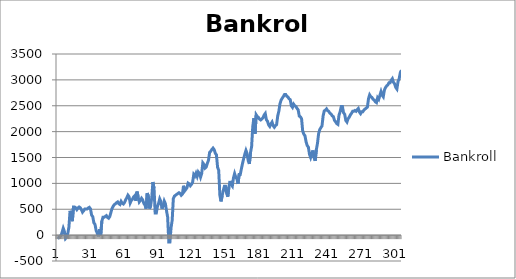
| Category | Bankroll |
|---|---|
| 0 | -35 |
| 1 | -50 |
| 2 | -22.665 |
| 3 | -7.665 |
| 4 | 55.335 |
| 5 | 133.035 |
| 6 | 73.035 |
| 7 | -66.965 |
| 8 | -42.965 |
| 9 | 29.275 |
| 10 | 155.275 |
| 11 | 468.715 |
| 12 | 408.715 |
| 13 | 268.715 |
| 14 | 542.795 |
| 15 | 542.795 |
| 16 | 527.795 |
| 17 | 492.795 |
| 18 | 524.61 |
| 19 | 544.11 |
| 20 | 529.11 |
| 21 | 494.11 |
| 22 | 444.11 |
| 23 | 471.11 |
| 24 | 504.43 |
| 25 | 504.43 |
| 26 | 504.43 |
| 27 | 525.01 |
| 28 | 537.01 |
| 29 | 507.01 |
| 30 | 387.01 |
| 31 | 357.01 |
| 32 | 237.01 |
| 33 | 207.01 |
| 34 | 87.01 |
| 35 | 37.01 |
| 36 | -22.99 |
| 37 | 114.05 |
| 38 | -5.95 |
| 39 | 268.13 |
| 40 | 343.13 |
| 41 | 343.13 |
| 42 | 361.54 |
| 43 | 376.54 |
| 44 | 341.54 |
| 45 | 326.54 |
| 46 | 359.54 |
| 47 | 438.38 |
| 48 | 515.28 |
| 49 | 558.73 |
| 50 | 587.885 |
| 51 | 605.885 |
| 52 | 626.465 |
| 53 | 641.465 |
| 54 | 606.465 |
| 55 | 591.465 |
| 56 | 651.465 |
| 57 | 616.465 |
| 58 | 601.465 |
| 59 | 630.025 |
| 60 | 682.105 |
| 61 | 722.105 |
| 62 | 772.105 |
| 63 | 742.105 |
| 64 | 622.105 |
| 65 | 670.105 |
| 66 | 694.105 |
| 67 | 737.505 |
| 68 | 761.505 |
| 69 | 661.505 |
| 70 | 841.505 |
| 71 | 741.505 |
| 72 | 641.505 |
| 73 | 671.505 |
| 74 | 712.175 |
| 75 | 682.175 |
| 76 | 612.175 |
| 77 | 582.175 |
| 78 | 512.175 |
| 79 | 812.175 |
| 80 | 752.175 |
| 81 | 512.175 |
| 82 | 560.175 |
| 83 | 725.535 |
| 84 | 1025.535 |
| 85 | 905.535 |
| 86 | 425.535 |
| 87 | 425.535 |
| 88 | 553.635 |
| 89 | 613.635 |
| 90 | 701.135 |
| 91 | 651.135 |
| 92 | 511.135 |
| 93 | 571.135 |
| 94 | 658.635 |
| 95 | 608.635 |
| 96 | 468.635 |
| 97 | 348.635 |
| 98 | -131.365 |
| 99 | -131.365 |
| 100 | 144.155 |
| 101 | 288.155 |
| 102 | 704.795 |
| 103 | 754.795 |
| 104 | 770.995 |
| 105 | 788.495 |
| 106 | 803.495 |
| 107 | 819.385 |
| 108 | 804.385 |
| 109 | 769.385 |
| 110 | 790.385 |
| 111 | 953.585 |
| 112 | 853.585 |
| 113 | 882.145 |
| 114 | 913.925 |
| 115 | 1004.825 |
| 116 | 989.825 |
| 117 | 954.825 |
| 118 | 981.825 |
| 119 | 1021.795 |
| 120 | 1171.795 |
| 121 | 1141.795 |
| 122 | 1196.275 |
| 123 | 1136.275 |
| 124 | 1220.275 |
| 125 | 1190.275 |
| 126 | 1120.275 |
| 127 | 1192.275 |
| 128 | 1396.275 |
| 129 | 1366.275 |
| 130 | 1296.275 |
| 131 | 1317.575 |
| 132 | 1387.575 |
| 133 | 1447.575 |
| 134 | 1601.175 |
| 135 | 1622.175 |
| 136 | 1657.175 |
| 137 | 1681.675 |
| 138 | 1651.675 |
| 139 | 1581.675 |
| 140 | 1551.675 |
| 141 | 1311.675 |
| 142 | 1251.675 |
| 143 | 771.675 |
| 144 | 651.675 |
| 145 | 759.475 |
| 146 | 861.475 |
| 147 | 942.675 |
| 148 | 942.675 |
| 149 | 802.675 |
| 150 | 742.675 |
| 151 | 934.675 |
| 152 | 1045.675 |
| 153 | 975.675 |
| 154 | 945.675 |
| 155 | 1106.475 |
| 156 | 1189.275 |
| 157 | 1119.275 |
| 158 | 1089.275 |
| 159 | 989.275 |
| 160 | 1173.835 |
| 161 | 1173.835 |
| 162 | 1283.175 |
| 163 | 1387.575 |
| 164 | 1478.435 |
| 165 | 1565.435 |
| 166 | 1636.835 |
| 167 | 1576.835 |
| 168 | 1436.835 |
| 169 | 1376.835 |
| 170 | 1592.835 |
| 171 | 1714.035 |
| 172 | 2100.915 |
| 173 | 2259.315 |
| 174 | 1959.315 |
| 175 | 2325.315 |
| 176 | 2290.315 |
| 177 | 2275.315 |
| 178 | 2240.315 |
| 179 | 2225.315 |
| 180 | 2244.635 |
| 181 | 2266.535 |
| 182 | 2321.135 |
| 183 | 2349.995 |
| 184 | 2229.995 |
| 185 | 2199.995 |
| 186 | 2129.995 |
| 187 | 2099.995 |
| 188 | 2148.295 |
| 189 | 2184.295 |
| 190 | 2114.295 |
| 191 | 2084.295 |
| 192 | 2115.795 |
| 193 | 2136.045 |
| 194 | 2304.045 |
| 195 | 2396.445 |
| 196 | 2540.445 |
| 197 | 2610.645 |
| 198 | 2647.045 |
| 199 | 2678.845 |
| 200 | 2718.815 |
| 201 | 2718.815 |
| 202 | 2683.815 |
| 203 | 2668.815 |
| 204 | 2633.815 |
| 205 | 2618.815 |
| 206 | 2498.815 |
| 207 | 2468.815 |
| 208 | 2530.015 |
| 209 | 2500.015 |
| 210 | 2485.015 |
| 211 | 2450.015 |
| 212 | 2420.015 |
| 213 | 2300.015 |
| 214 | 2285.015 |
| 215 | 2250.015 |
| 216 | 2010.015 |
| 217 | 1950.015 |
| 218 | 1920.015 |
| 219 | 1800.015 |
| 220 | 1730.015 |
| 221 | 1700.015 |
| 222 | 1560.015 |
| 223 | 1500.015 |
| 224 | 1570.015 |
| 225 | 1636.015 |
| 226 | 1496.015 |
| 227 | 1436.015 |
| 228 | 1649.135 |
| 229 | 1769.135 |
| 230 | 1958.015 |
| 231 | 2039.615 |
| 232 | 2075.455 |
| 233 | 2109.955 |
| 234 | 2304.355 |
| 235 | 2400.355 |
| 236 | 2416.855 |
| 237 | 2439.885 |
| 238 | 2404.885 |
| 239 | 2389.885 |
| 240 | 2354.885 |
| 241 | 2339.885 |
| 242 | 2304.885 |
| 243 | 2289.885 |
| 244 | 2219.885 |
| 245 | 2189.885 |
| 246 | 2154.885 |
| 247 | 2139.885 |
| 248 | 2320.365 |
| 249 | 2386.365 |
| 250 | 2484.765 |
| 251 | 2484.765 |
| 252 | 2364.765 |
| 253 | 2334.765 |
| 254 | 2214.765 |
| 255 | 2184.765 |
| 256 | 2249.565 |
| 257 | 2279.565 |
| 258 | 2322.965 |
| 259 | 2352.965 |
| 260 | 2392.725 |
| 261 | 2392.725 |
| 262 | 2408.79 |
| 263 | 2393.79 |
| 264 | 2423.19 |
| 265 | 2447.19 |
| 266 | 2377.19 |
| 267 | 2347.19 |
| 268 | 2384.85 |
| 269 | 2384.85 |
| 270 | 2417.575 |
| 271 | 2437.075 |
| 272 | 2456.185 |
| 273 | 2472.685 |
| 274 | 2638.285 |
| 275 | 2710.285 |
| 276 | 2675.285 |
| 277 | 2660.285 |
| 278 | 2625.285 |
| 279 | 2610.285 |
| 280 | 2575.285 |
| 281 | 2560.285 |
| 282 | 2654.725 |
| 283 | 2624.725 |
| 284 | 2700.465 |
| 285 | 2772.465 |
| 286 | 2702.465 |
| 287 | 2672.465 |
| 288 | 2804.225 |
| 289 | 2852.225 |
| 290 | 2883.725 |
| 291 | 2903.225 |
| 292 | 2942.985 |
| 293 | 2942.985 |
| 294 | 2992.685 |
| 295 | 3022.685 |
| 296 | 2952.685 |
| 297 | 2922.685 |
| 298 | 2852.685 |
| 299 | 2822.685 |
| 300 | 2968.125 |
| 301 | 3022.125 |
| 302 | 3139.245 |
| 303 | 3187.245 |